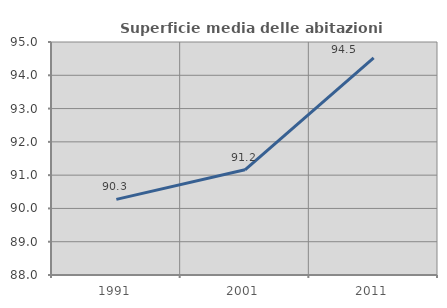
| Category | Superficie media delle abitazioni occupate |
|---|---|
| 1991.0 | 90.272 |
| 2001.0 | 91.162 |
| 2011.0 | 94.521 |